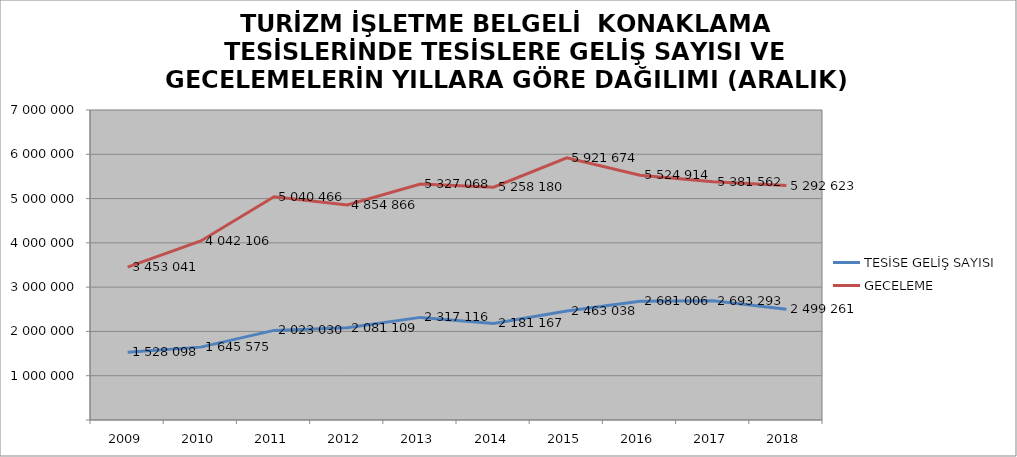
| Category | TESİSE GELİŞ SAYISI | GECELEME |
|---|---|---|
| 2009 | 1528098 | 3453041 |
| 2010 | 1645575 | 4042106 |
| 2011 | 2023030 | 5040466 |
| 2012 | 2081109 | 4854866 |
| 2013 | 2317116 | 5327068 |
| 2014 | 2181167 | 5258180 |
| 2015 | 2463038 | 5921674 |
| 2016 | 2681006 | 5524914 |
| 2017 | 2693293 | 5381562 |
| 2018 | 2499261 | 5292623 |